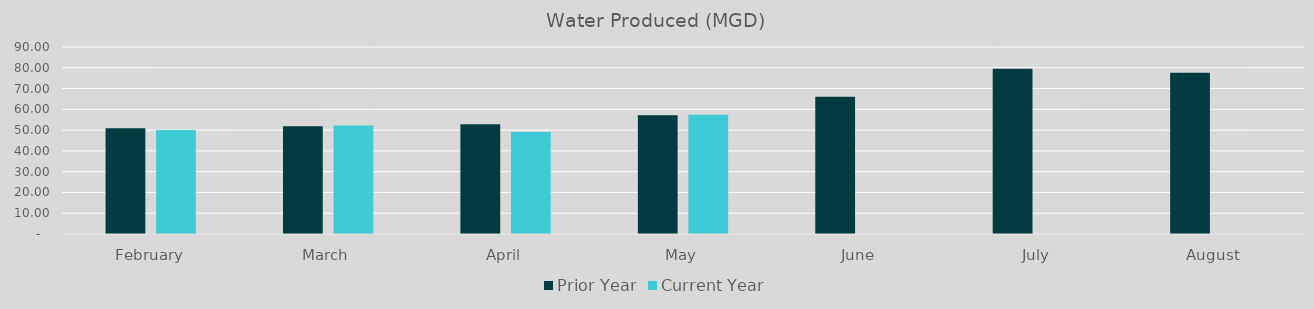
| Category | Prior Year | Current Year |
|---|---|---|
| February | 50.84 | 50.11 |
| March | 51.85 | 52.27 |
| April | 52.78 | 49.07 |
| May | 57.16 | 57.41 |
| June | 66.11 | 0 |
| July | 79.53 | 0 |
| August | 77.55 | 0 |